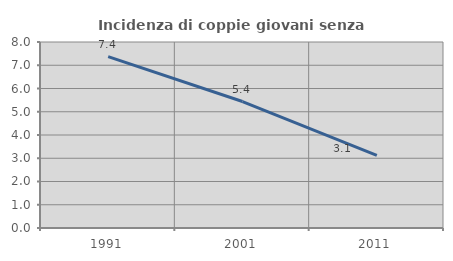
| Category | Incidenza di coppie giovani senza figli |
|---|---|
| 1991.0 | 7.37 |
| 2001.0 | 5.439 |
| 2011.0 | 3.128 |